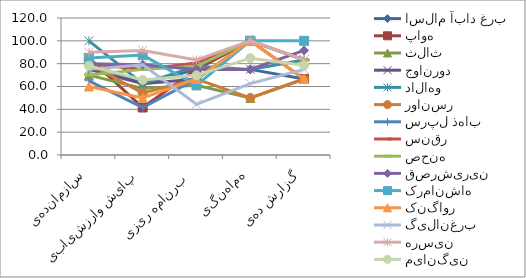
| Category | اسلام آباد غرب | پاوه | ثلاث | جوانرود | دالاهو | روانسر | سرپل ذهاب | سنقر | صحنه | قصرشیرین | کرمانشاه | کنگاور | گیلانغرب | هرسین | میانگین |
|---|---|---|---|---|---|---|---|---|---|---|---|---|---|---|---|
| سازماندهی | 80 | 85 | 70 | 75 | 100 | 80 | 65 | 80 | 70 | 80 | 85 | 60 | 75 | 90 | 78.214 |
| پایش وارزشیابی | 62.5 | 41.6 | 58.3 | 62.5 | 62.5 | 54.1 | 41.6 | 75 | 75 | 79.1 | 87.5 | 50 | 79.1 | 91.6 | 65.743 |
| برنامه ریزی  | 75 | 75 | 61.1 | 66.5 | 77.7 | 66.6 | 66.6 | 80.5 | 77.7 | 75 | 61.1 | 66.6 | 44.4 | 83.3 | 69.793 |
| هماهنگی | 75 | 100 | 50 | 100 | 75 | 50 | 100 | 100 | 100 | 75 | 100 | 100 | 62.5 | 100 | 84.821 |
| گزارش دهی | 66.6 | 66.6 | 66.6 | 83.3 | 83.3 | 66.6 | 83.3 | 83.3 | 83.3 | 91.6 | 100 | 66.6 | 75 | 83.3 | 78.529 |